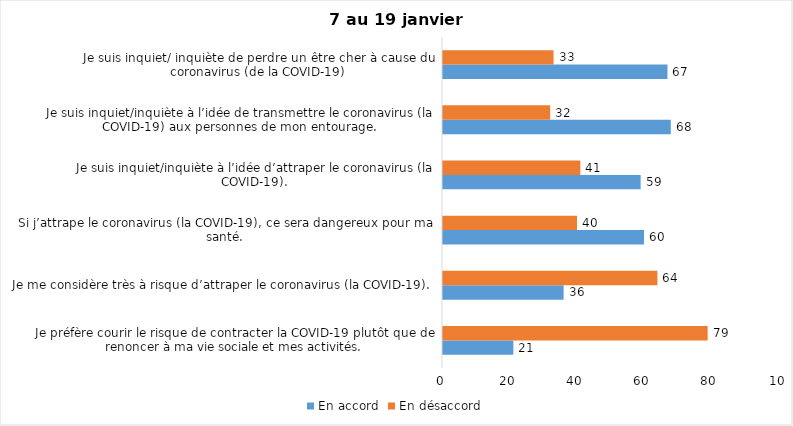
| Category | En accord | En désaccord |
|---|---|---|
| Je préfère courir le risque de contracter la COVID-19 plutôt que de renoncer à ma vie sociale et mes activités. | 21 | 79 |
| Je me considère très à risque d’attraper le coronavirus (la COVID-19). | 36 | 64 |
| Si j’attrape le coronavirus (la COVID-19), ce sera dangereux pour ma santé. | 60 | 40 |
| Je suis inquiet/inquiète à l’idée d’attraper le coronavirus (la COVID-19). | 59 | 41 |
| Je suis inquiet/inquiète à l’idée de transmettre le coronavirus (la COVID-19) aux personnes de mon entourage. | 68 | 32 |
| Je suis inquiet/ inquiète de perdre un être cher à cause du coronavirus (de la COVID-19) | 67 | 33 |